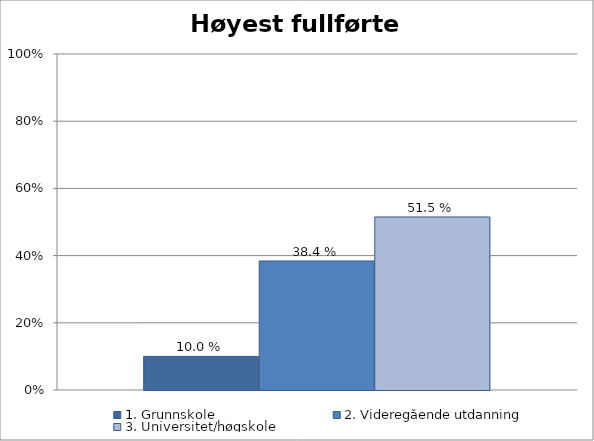
| Category | 1. Grunnskole | 2. Videregående utdanning | 3. Universitet/høgskole |
|---|---|---|---|
| Hva er din høyeste fullførte utdanning? | 0.1 | 0.384 | 0.515 |